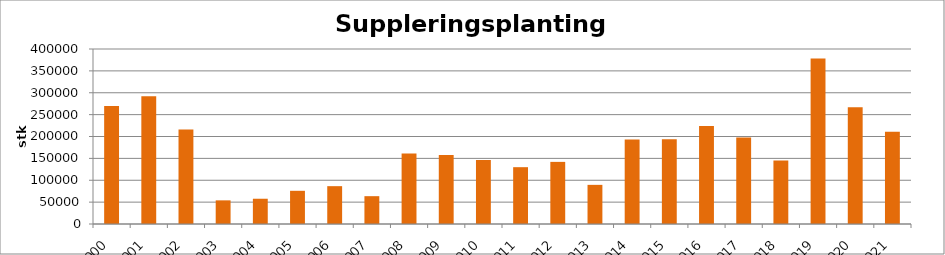
| Category | Totalt |
|---|---|
| 2000 | 269930 |
| 2001 | 291906 |
| 2002 | 215920 |
| 2003 | 54031 |
| 2004 | 57735 |
| 2005 | 75861 |
| 2006 | 86495 |
| 2007 | 63610 |
| 2008 | 161415 |
| 2009 | 157780 |
| 2010 | 146294 |
| 2011 | 129865 |
| 2012 | 141975 |
| 2013 | 89470 |
| 2014 | 193035 |
| 2015 | 193690 |
| 2016 | 224175 |
| 2017 | 197545 |
| 2018 | 145130 |
| 2019 | 378525 |
| 2020 | 266651 |
| 2021 | 211095 |